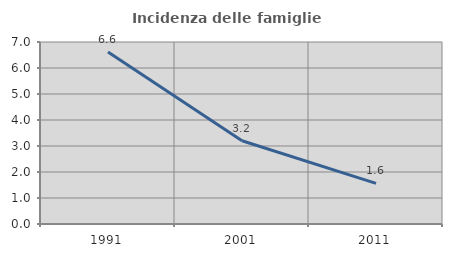
| Category | Incidenza delle famiglie numerose |
|---|---|
| 1991.0 | 6.615 |
| 2001.0 | 3.2 |
| 2011.0 | 1.564 |